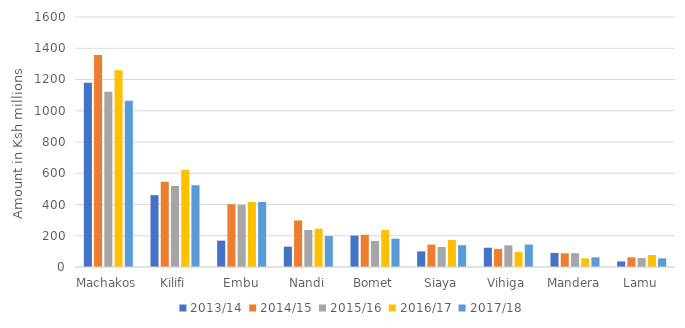
| Category | 2013/14 | 2014/15 | 2015/16 | 2016/17 | 2017/18  |
|---|---|---|---|---|---|
| Machakos | 1180 | 1356.56 | 1121.681 | 1259.305 | 1063.727 |
| Kilifi | 459.6 | 545.499 | 519.076 | 620.094 | 523.347 |
| Embu | 168.5 | 401.105 | 396.526 | 416.272 | 416.112 |
| Nandi | 130.5 | 298.042 | 236.899 | 244.731 | 197.887 |
| Bomet | 200.9 | 206.386 | 166.987 | 236.697 | 181.375 |
| Siaya | 100 | 143.328 | 127.932 | 172.837 | 139.337 |
| Vihiga | 123.3 | 115.939 | 138.938 | 96.033 | 143.531 |
| Mandera | 90.1 | 87.729 | 88.235 | 55.844 | 61.813 |
| Lamu | 35.6 | 61.672 | 57.324 | 76.961 | 55.287 |